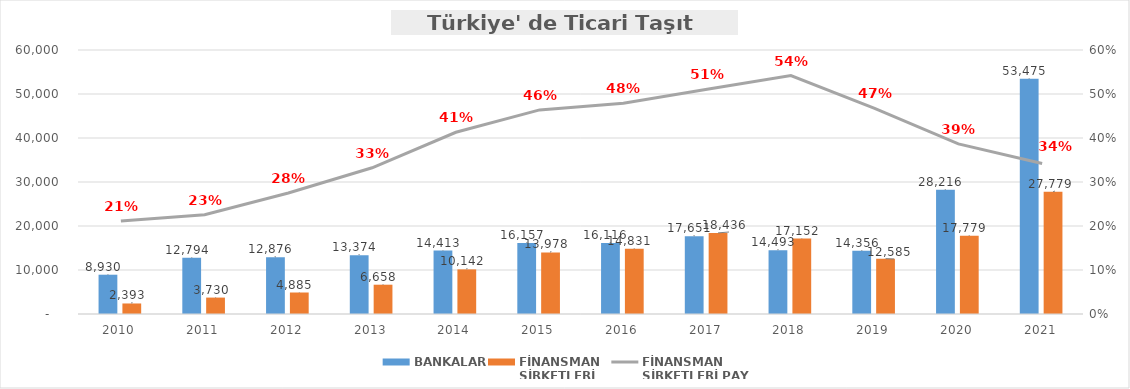
| Category | BANKALAR | FİNANSMAN 
ŞİRKETLERİ |
|---|---|---|
| 2010 | 8930.131 | 2392.721 |
| 2011 | 12793.723 | 3729.987 |
| 2012 | 12876.346 | 4885.495 |
| 2013 | 13374.424 | 6657.806 |
| 2014 | 14412.767 | 10141.887 |
| 2015 | 16157.225 | 13978.426 |
| 2016 | 16116.463 | 14831.249 |
| 2017 | 17650.963 | 18436.034 |
| 2018 | 14492.83 | 17152.034 |
| 2019 | 14355.978 | 12584.792 |
| 2020 | 28216.157 | 17779.072 |
| 2021 | 53475.488 | 27778.932 |